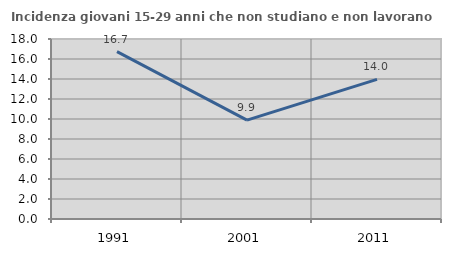
| Category | Incidenza giovani 15-29 anni che non studiano e non lavorano  |
|---|---|
| 1991.0 | 16.741 |
| 2001.0 | 9.894 |
| 2011.0 | 13.967 |